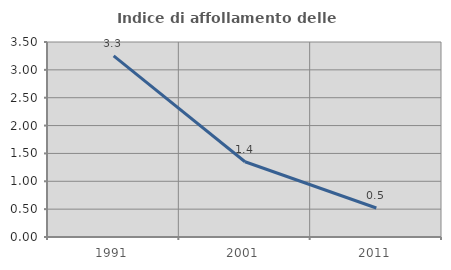
| Category | Indice di affollamento delle abitazioni  |
|---|---|
| 1991.0 | 3.252 |
| 2001.0 | 1.351 |
| 2011.0 | 0.521 |